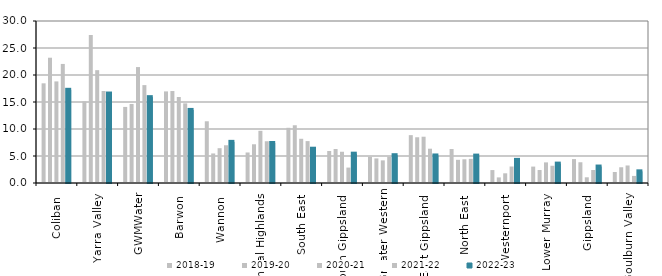
| Category | 2018-19 | 2019-20 | 2020-21 | 2021-22 | 2022-23 |
|---|---|---|---|---|---|
| Coliban  | 18.46 | 23.199 | 18.814 | 22.049 | 17.258 |
| Yarra Valley  | 15.101 | 27.426 | 20.897 | 17.036 | 16.57 |
| GWMWater | 14.089 | 14.636 | 21.468 | 18.127 | 15.898 |
| Barwon  | 16.964 | 17.031 | 15.931 | 14.747 | 13.531 |
| Wannon  | 11.43 | 5.472 | 6.446 | 6.989 | 7.617 |
| Central Highlands  | 5.651 | 7.172 | 9.662 | 7.732 | 7.407 |
| South East  | 10.222 | 10.693 | 8.189 | 7.76 | 6.349 |
| South Gippsland  | 5.929 | 6.294 | 5.787 | 2.857 | 5.431 |
| Greater Western | 4.869 | 4.556 | 4.191 | 4.869 | 5.149 |
| East Gippsland  | 8.861 | 8.47 | 8.571 | 6.351 | 5.099 |
| North East  | 6.291 | 4.294 | 4.39 | 4.471 | 5.074 |
| Westernport  | 2.394 | 1.037 | 1.794 | 3.053 | 4.282 |
| Lower Murray  | 3.04 | 2.402 | 3.818 | 3.193 | 3.592 |
| Gippsland  | 4.427 | 3.84 | 1.056 | 2.41 | 3.048 |
| Goulburn Valley  | 2.039 | 2.914 | 3.245 | 1.311 | 2.158 |